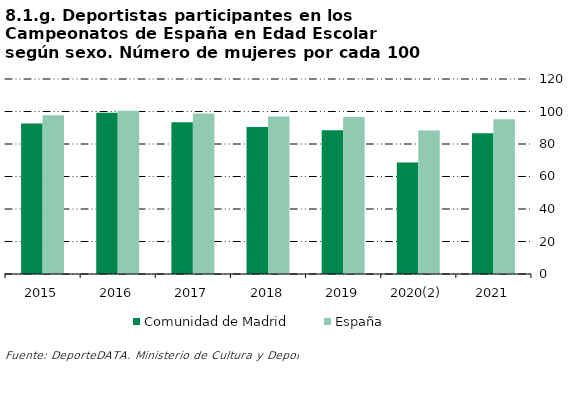
| Category | Comunidad de Madrid | España |
|---|---|---|
| 2015 | 92.636 | 97.743 |
| 2016 | 99.187 | 100.47 |
| 2017 | 93.38 | 98.793 |
| 2018 | 90.492 | 96.867 |
| 2019 | 88.438 | 96.607 |
| 2020(2) | 68.595 | 88.252 |
| 2021 | 86.589 | 95.206 |